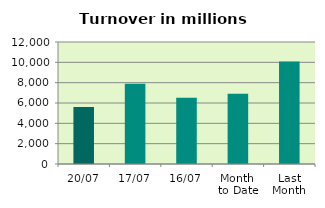
| Category | Series 0 |
|---|---|
| 20/07 | 5616.955 |
| 17/07 | 7901.003 |
| 16/07 | 6506.691 |
| Month 
to Date | 6902.373 |
| Last
Month | 10085.686 |